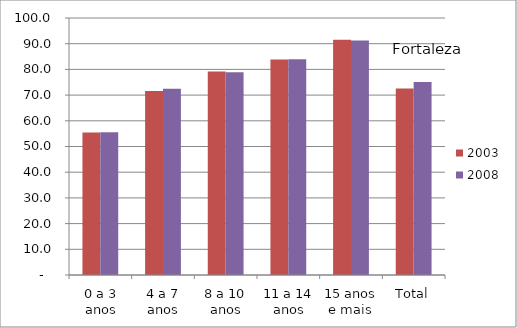
| Category | 2003 | 2008 |
|---|---|---|
| 0 a 3 anos | 55.42 | 55.51 |
| 4 a 7 anos | 71.58 | 72.47 |
| 8 a 10 anos | 79.2 | 78.88 |
| 11 a 14 anos | 83.86 | 83.91 |
| 15 anos e mais | 91.58 | 91.2 |
| Total | 72.61 | 75.06 |